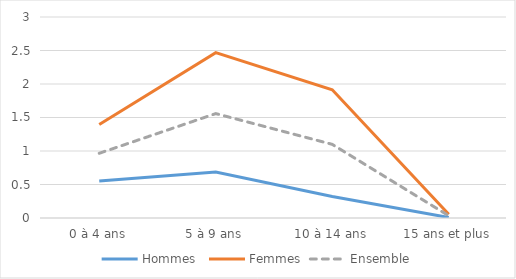
| Category | Hommes  | Femmes | Ensemble |
|---|---|---|---|
| 0 à 4 ans | 0.554 | 1.395 | 0.966 |
| 5 à 9 ans | 0.688 | 2.468 | 1.558 |
| 10 à 14 ans | 0.322 | 1.913 | 1.099 |
| 15 ans et plus | 0.007 | 0.057 | 0.033 |